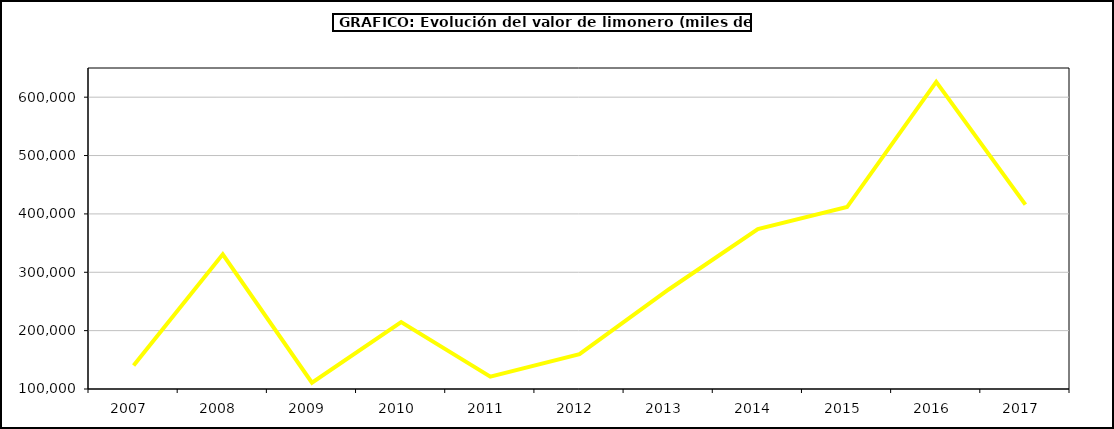
| Category | Valor |
|---|---|
| 2007.0 | 140203.613 |
| 2008.0 | 330828.422 |
| 2009.0 | 110910.366 |
| 2010.0 | 214653.894 |
| 2011.0 | 121030.951 |
| 2012.0 | 159689.894 |
| 2013.0 | 270510.614 |
| 2014.0 | 373950.238 |
| 2015.0 | 411737 |
| 2016.0 | 626329 |
| 2017.0 | 415897.996 |